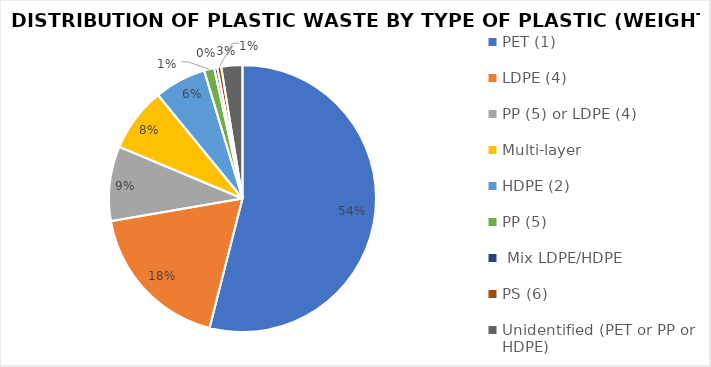
| Category | Series 0 |
|---|---|
| PET (1) | 266.96 |
| LDPE (4) | 90.65 |
| PP (5) or LDPE (4) | 44.697 |
| Multi-layer | 38.471 |
| HDPE (2) | 30.99 |
| PP (5) | 6.1 |
|  Mix LDPE/HDPE | 1.8 |
| PS (6) | 2.41 |
| Unidentified (PET or PP or HDPE) | 12.64 |